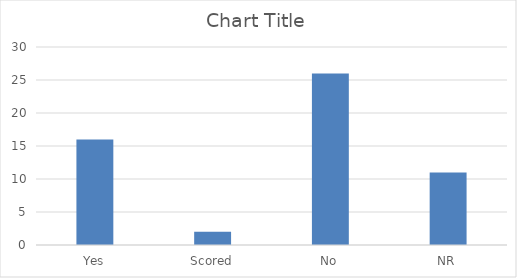
| Category | Series 0 |
|---|---|
| Yes | 16 |
| Scored | 2 |
| No | 26 |
| NR | 11 |